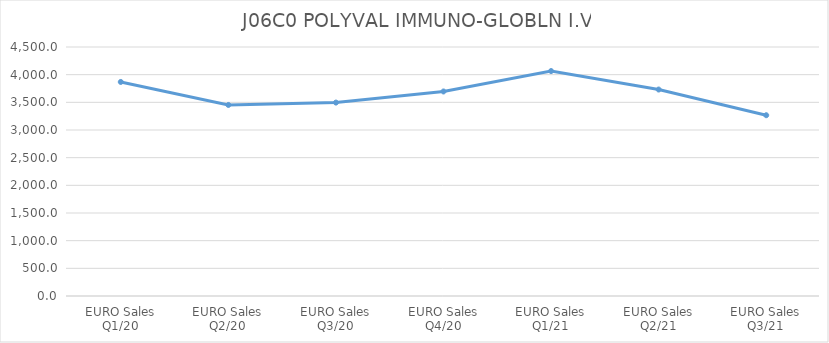
| Category |  J06C0 POLYVAL IMMUNO-GLOBLN I.V |
|---|---|
| EURO Sales
Q1/20 | 3868.47 |
| EURO Sales
Q2/20 | 3452.71 |
| EURO Sales
Q3/20 | 3495.53 |
| EURO Sales
Q4/20 | 3696.329 |
| EURO Sales
Q1/21 | 4065.185 |
| EURO Sales
Q2/21 | 3731.325 |
| EURO Sales
Q3/21 | 3267.176 |